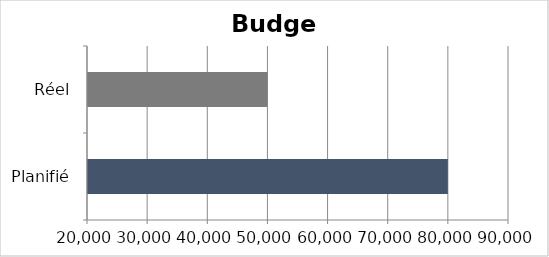
| Category | Series 0 |
|---|---|
| Planifié | 80000 |
| Réel | 50000 |